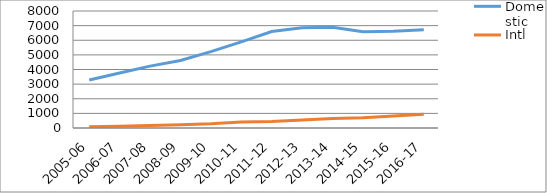
| Category | Domestic | Intl |
|---|---|---|
| 2005-06 | 3281 | 80 |
| 2006-07 | 3762 | 120 |
| 2007-08 | 4230 | 174 |
| 2008-09 | 4615 | 230 |
| 2009-10 | 5220 | 292 |
| 2010-11 | 5888 | 404 |
| 2011-12 | 6593 | 445 |
| 2012-13 | 6849 | 551 |
| 2013-14 | 6894 | 649 |
| 2014-15 | 6589 | 697 |
| 2015-16 | 6607 | 820 |
| 2016-17 | 6724 | 944 |